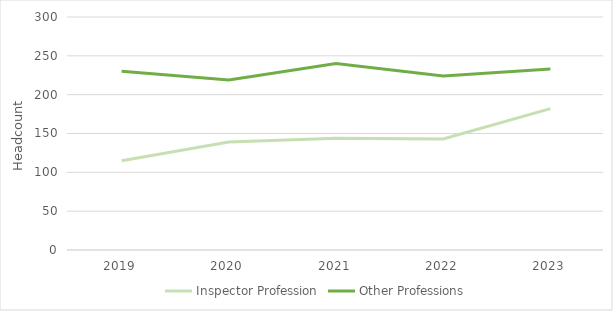
| Category | Inspector Profession | Other Professions |
|---|---|---|
| 2019.0 | 115 | 230 |
| 2020.0 | 139 | 219 |
| 2021.0 | 144 | 240 |
| 2022.0 | 143 | 224 |
| 2023.0 | 182 | 233 |